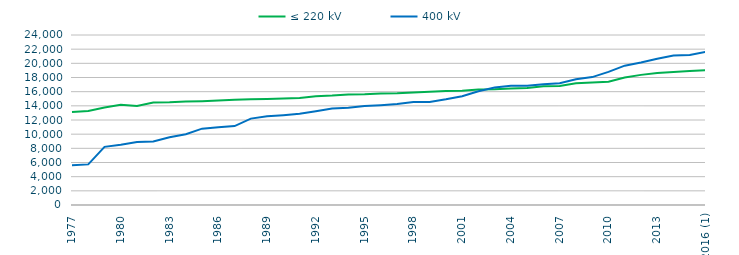
| Category | ≤ 220 kV | 400 kV |
|---|---|---|
| 1977 | 13138 | 5595 |
| 1978 | 13258 | 5732 |
| 1979 | 13767 | 8207 |
| 1980 | 14139 | 8518 |
| 1981 | 13973 | 8906 |
| 1982 | 14466 | 8975 |
| 1983 | 14491 | 9563 |
| 1984 | 14598.3 | 9998 |
| 1985 | 14652.3 | 10781 |
| 1986 | 14746.3 | 10978 |
| 1987 | 14849.3 | 11147 |
| 1988 | 14938.3 | 12194 |
| 1989 | 14964.3 | 12533 |
| 1990 | 15034.5 | 12686 |
| 1991 | 15108.94 | 12883 |
| 1992 | 15356.14 | 13222 |
| 1993 | 15441.94 | 13611.17 |
| 1994 | 15585.94 | 13737.17 |
| 1995 | 15628.94 | 13969.73 |
| 1996 | 15733.54 | 14083.63 |
| 1997 | 15776.14 | 14243.65 |
| 1998 | 15875.92 | 14538.47 |
| 1999 | 15974.92 | 14538.47 |
| 2000 | 16077.74 | 14918 |
| 2001 | 16121.467 | 15364.269 |
| 2002 | 16296.158 | 16066.739 |
| 2003 | 16344.268 | 16592.459 |
| 2004 | 16464.172 | 16840.612 |
| 2005 | 16529.9 | 16845.694 |
| 2006 | 16752.829 | 17051.943 |
| 2007 | 16817.033 | 17190.606 |
| 2008 | 17174.804 | 17764.621 |
| 2009 | 17307.192 | 18056.021 |
| 2010 | 17400.504 | 18792.423 |
| 2011 | 18000.768 | 19671.35 |
| 2012 | 18369.641 | 20108.846 |
| 2013 | 18642.941 | 20639.478 |
| 2014 | 18782.059 | 21093.512 |
| 2015 | 18922.362 | 21183.826 |
| 2016 (1) | 19026.041 | 21619.966 |